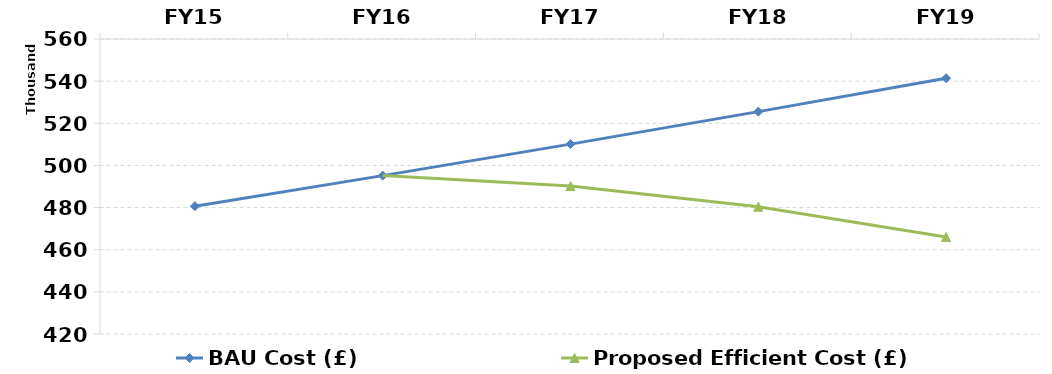
| Category | BAU Cost (£) | Proposed Efficient Cost (£) | Proposed Efficiency (YoY % Variance) |
|---|---|---|---|
| FY15 | 480649.728 | 480649.728 |  |
| FY16 | 495165.357 | 495165.357 |  |
| FY17 | 510119.367 | 490213.704 |  |
| FY18 | 525524.978 | 480409.43 |  |
| FY19 | 541395.835 | 465997.147 |  |